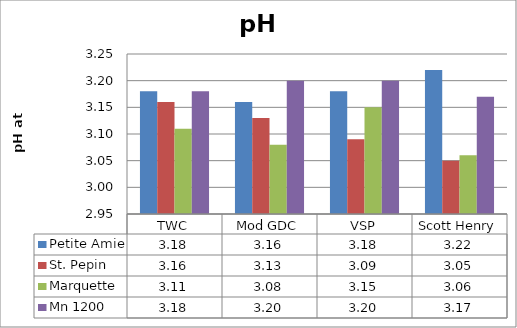
| Category | Petite Amie | St. Pepin | Marquette | Mn 1200 |
|---|---|---|---|---|
| 0 | 3.18 | 3.16 | 3.11 | 3.18 |
| 1 | 3.16 | 3.13 | 3.08 | 3.2 |
| 2 | 3.18 | 3.09 | 3.15 | 3.2 |
| 3 | 3.22 | 3.05 | 3.06 | 3.17 |